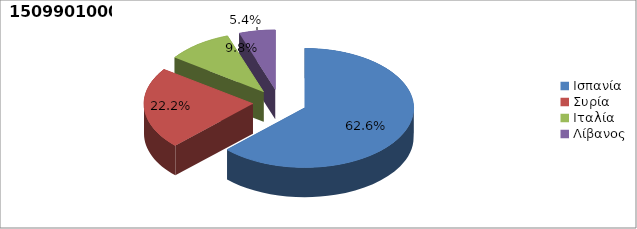
| Category | Series 0 |
|---|---|
| Ισπανία | 0.626 |
| Συρία | 0.222 |
| Ιταλία | 0.098 |
| Λίβανος | 0.054 |